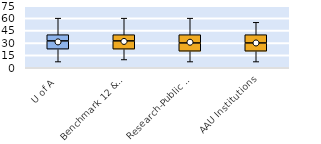
| Category | 25th | 50th | 75th |
|---|---|---|---|
| U of A | 22.5 | 10 | 7.5 |
| Benchmark 12 & SEC | 22.5 | 10 | 7.5 |
| Research-Public Univ | 20 | 10 | 10 |
| AAU Institutions | 20 | 10 | 10 |